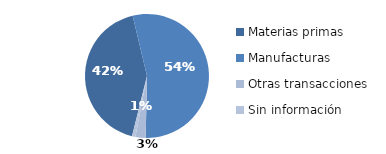
| Category | Series 0 |
|---|---|
| Materias primas | 1372.765 |
| Manufacturas | 1750.253 |
| Otras transacciones | 86.315 |
| Sin información | 28.565 |